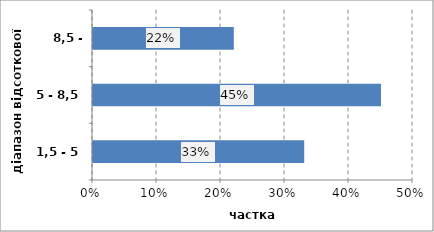
| Category | Series 0 |
|---|---|
| 1,5 - 5 | 0.33 |
| 5 - 8,5 | 0.45 |
| 8,5 - 12 | 0.22 |